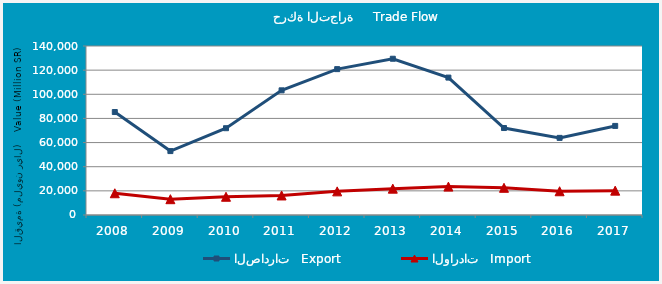
| Category | الصادرات   Export | الواردات   Import |
|---|---|---|
| 2008.0 | 85295157643 | 18011717564 |
| 2009.0 | 52950632446 | 13094504997 |
| 2010.0 | 71891265072 | 15116181988 |
| 2011.0 | 103271729813 | 16191118313 |
| 2012.0 | 120840682120 | 19580943752 |
| 2013.0 | 129444087040 | 21821667021 |
| 2014.0 | 113828373160 | 23508543092 |
| 2015.0 | 72052057139 | 22532077423 |
| 2016.0 | 63879803613 | 19662468637 |
| 2017.0 | 73801213531 | 20175674622 |